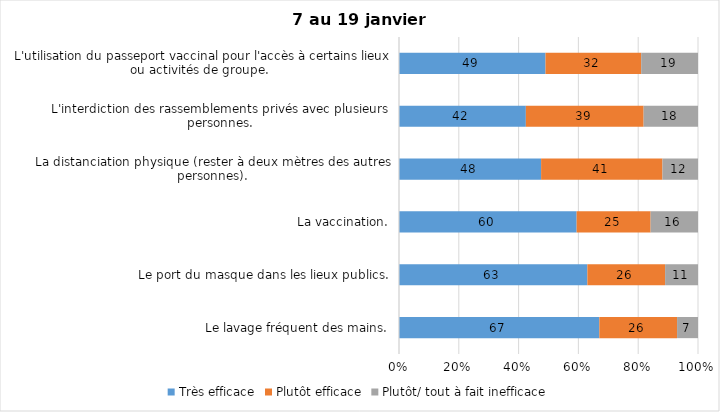
| Category | Très efficace | Plutôt efficace | Plutôt/ tout à fait inefficace |
|---|---|---|---|
| Le lavage fréquent des mains. | 67 | 26 | 7 |
| Le port du masque dans les lieux publics. | 63 | 26 | 11 |
| La vaccination. | 60 | 25 | 16 |
| La distanciation physique (rester à deux mètres des autres personnes). | 48 | 41 | 12 |
| L'interdiction des rassemblements privés avec plusieurs personnes. | 42 | 39 | 18 |
| L'utilisation du passeport vaccinal pour l'accès à certains lieux ou activités de groupe.  | 49 | 32 | 19 |